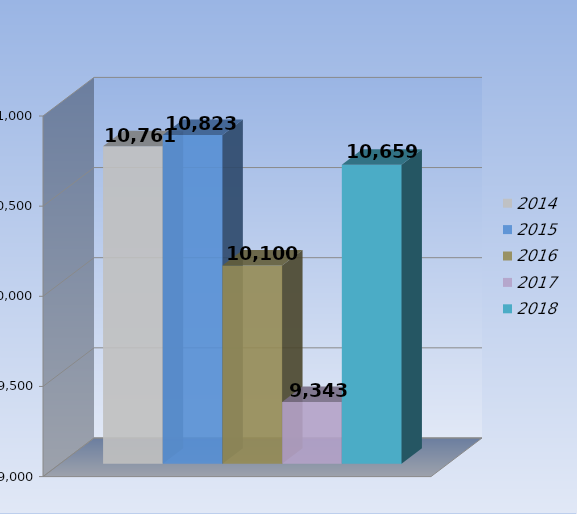
| Category | 2014 | 2015 | 2016 | 2017 | 2018 |
|---|---|---|---|---|---|
| 0 | 10761 | 10823 | 10100 | 9343 | 10659 |